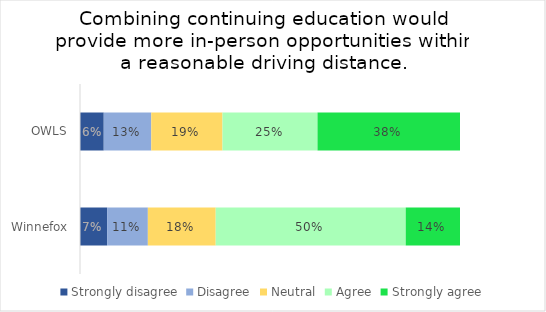
| Category | Strongly disagree | Disagree | Neutral | Agree | Strongly agree |
|---|---|---|---|---|---|
| OWLS | 0.062 | 0.125 | 0.188 | 0.25 | 0.375 |
| Winnefox | 0.071 | 0.107 | 0.179 | 0.5 | 0.143 |